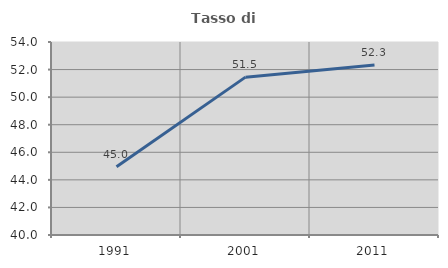
| Category | Tasso di occupazione   |
|---|---|
| 1991.0 | 44.957 |
| 2001.0 | 51.451 |
| 2011.0 | 52.331 |